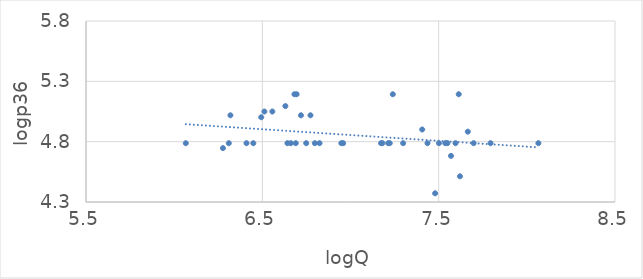
| Category | logQ |
|---|---|
| 7.4798641311650265 | 4.372 |
| 6.2766434893416445 | 4.747 |
| 7.665284718471351 | 4.883 |
| 6.773080375655535 | 5.019 |
| 6.630683385642372 | 5.095 |
| 7.5953872788539725 | 4.787 |
| 6.309918278226516 | 4.787 |
| 7.298445101508147 | 4.787 |
| 6.066108090103747 | 4.787 |
| 7.4067107301776405 | 4.901 |
| 6.71901315438526 | 5.019 |
| 7.213768308118642 | 4.787 |
| 6.947937068614969 | 4.787 |
| 6.493753839851686 | 5.003 |
| 7.222566018822171 | 4.787 |
| 6.9584483932976555 | 4.787 |
| 7.6984827878809465 | 4.787 |
| 6.6895992691789665 | 4.787 |
| 7.569927655242652 | 4.682 |
| 6.79794041297493 | 4.787 |
| 7.436617265234227 | 4.787 |
| 6.694562058521095 | 5.193 |
| 7.549609165154532 | 4.787 |
| 7.1808311990445555 | 4.787 |
| 6.410174881966167 | 4.787 |
| 7.613818684808629 | 5.193 |
| 6.318968113746434 | 5.019 |
| 7.501634457883413 | 4.787 |
| 7.794411205726601 | 4.787 |
| 7.1731917424865985 | 4.787 |
| 6.556778356158042 | 5.05 |
| 6.682108597449809 | 5.193 |
| 6.748759547491679 | 4.787 |
| 7.2399325913204695 | 5.193 |
| 7.620705086838262 | 4.513 |
| 6.824373670043086 | 4.787 |
| 6.511745329644728 | 5.05 |
| 6.661854740545311 | 4.787 |
| 8.065579427282092 | 4.787 |
| 6.448889394146858 | 4.787 |
| 6.642486801367256 | 4.787 |
| 7.537430036586509 | 4.787 |